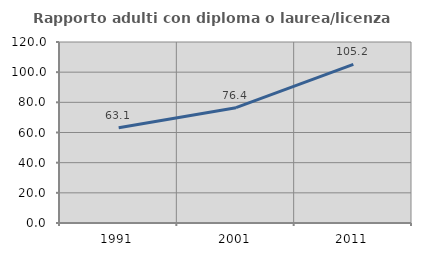
| Category | Rapporto adulti con diploma o laurea/licenza media  |
|---|---|
| 1991.0 | 63.084 |
| 2001.0 | 76.433 |
| 2011.0 | 105.162 |